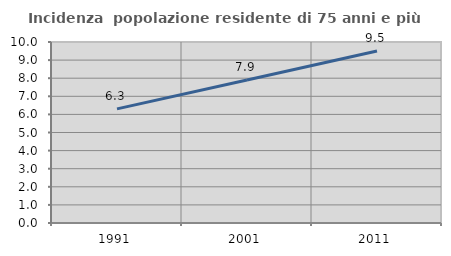
| Category | Incidenza  popolazione residente di 75 anni e più |
|---|---|
| 1991.0 | 6.306 |
| 2001.0 | 7.899 |
| 2011.0 | 9.499 |